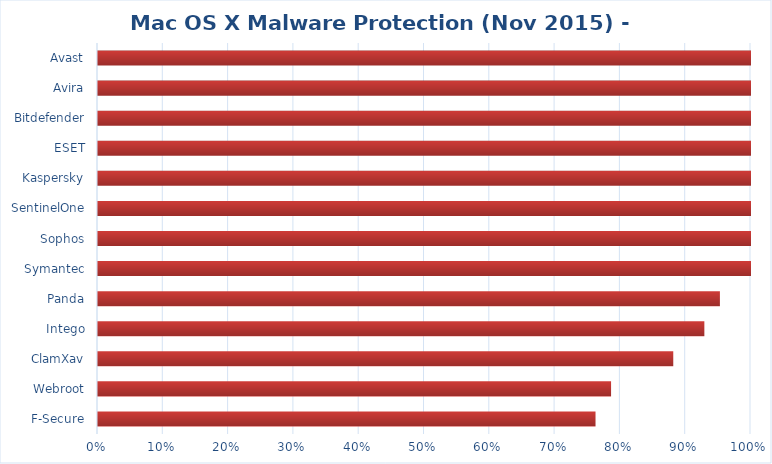
| Category | Series 0 |
|---|---|
| F-Secure | 0.762 |
| Webroot | 0.786 |
| ClamXav | 0.881 |
| Intego | 0.929 |
| Panda | 0.952 |
| Symantec | 1 |
| Sophos | 1 |
| SentinelOne | 1 |
| Kaspersky | 1 |
| ESET | 1 |
| Bitdefender | 1 |
| Avira | 1 |
| Avast | 1 |